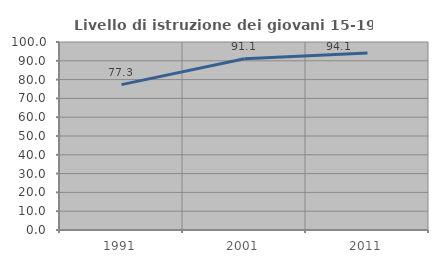
| Category | Livello di istruzione dei giovani 15-19 anni |
|---|---|
| 1991.0 | 77.32 |
| 2001.0 | 91.06 |
| 2011.0 | 94.098 |